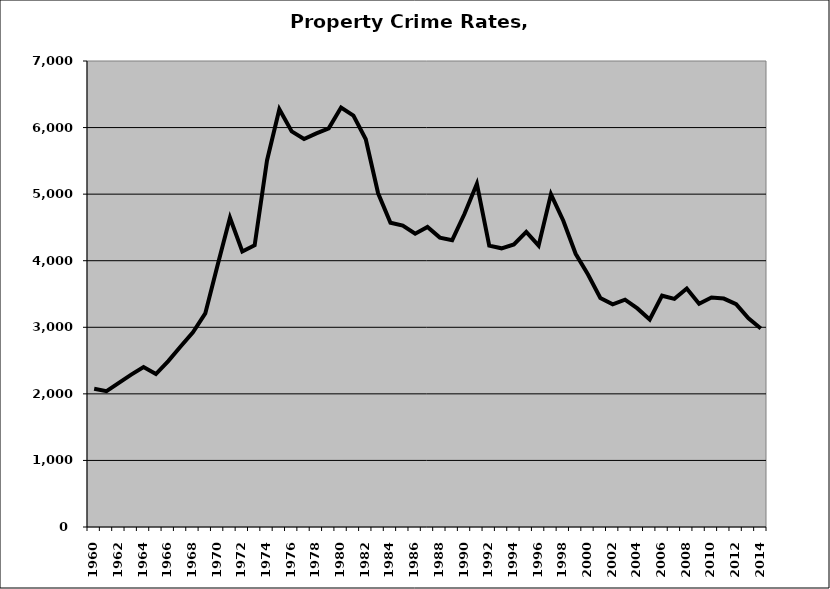
| Category | Property |
|---|---|
| 1960.0 | 2076.443 |
| 1961.0 | 2039.956 |
| 1962.0 | 2165.672 |
| 1963.0 | 2288.235 |
| 1964.0 | 2403.462 |
| 1965.0 | 2297.624 |
| 1966.0 | 2491.797 |
| 1967.0 | 2710.687 |
| 1968.0 | 2924.345 |
| 1969.0 | 3207.593 |
| 1970.0 | 3935.567 |
| 1971.0 | 4645.878 |
| 1972.0 | 4137.699 |
| 1973.0 | 4232.639 |
| 1974.0 | 5506.457 |
| 1975.0 | 6276.166 |
| 1976.0 | 5942.784 |
| 1977.0 | 5828.007 |
| 1978.0 | 5913.208 |
| 1979.0 | 5988.488 |
| 1980.0 | 6301.836 |
| 1981.0 | 6180.268 |
| 1982.0 | 5825.083 |
| 1983.0 | 5012.871 |
| 1984.0 | 4571.126 |
| 1985.0 | 4527.974 |
| 1986.0 | 4404.581 |
| 1987.0 | 4508.075 |
| 1988.0 | 4347.424 |
| 1989.0 | 4308.767 |
| 1990.0 | 4705.119 |
| 1991.0 | 5155.147 |
| 1992.0 | 4227.286 |
| 1993.0 | 4186.286 |
| 1994.0 | 4245.184 |
| 1995.0 | 4433.752 |
| 1996.0 | 4226.621 |
| 1997.0 | 4996.995 |
| 1998.0 | 4600.806 |
| 1999.0 | 4103.575 |
| 2000.0 | 3793.645 |
| 2001.0 | 3439.497 |
| 2002.0 | 3346.01 |
| 2003.0 | 3415.322 |
| 2004.0 | 3283.582 |
| 2005.0 | 3117.942 |
| 2006.0 | 3474.497 |
| 2007.0 | 3427.062 |
| 2008.0 | 3581.9 |
| 2009.0 | 3353.775 |
| 2010.0 | 3448.249 |
| 2011.0 | 3431.531 |
| 2012.0 | 3348.443 |
| 2013.0 | 3134.43 |
| 2014.0 | 2981.999 |